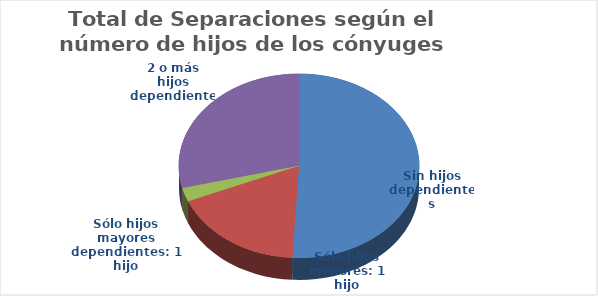
| Category | Series 0 |
|---|---|
| Sin hijos dependientes | 1869 |
| Sólo hijos menores: 1 hijo | 654 |
| Sólo hijos mayores dependientes: 1 hijo | 90 |
| 2 o más hijos dependientes | 1061 |